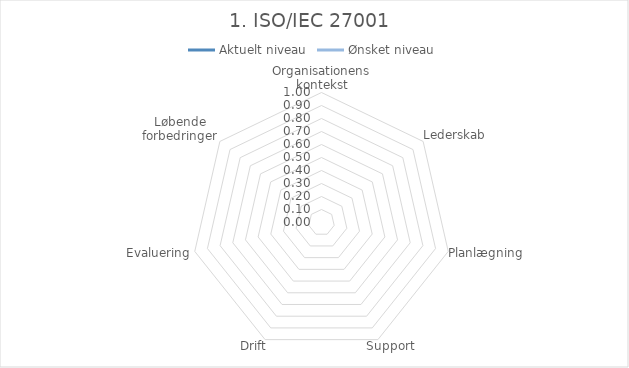
| Category | Aktuelt niveau | Ønsket niveau |
|---|---|---|
| 0 | 0 | 0 |
| 1 | 0 | 0 |
| 2 | 0 | 0 |
| 3 | 0 | 0 |
| 4 | 0 | 0 |
| 5 | 0 | 0 |
| 6 | 0 | 0 |